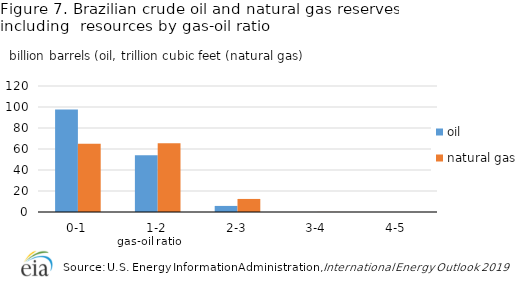
| Category | oil | natural gas |
|---|---|---|
| 0-1 | 97.554 | 65.112 |
| 1-2 | 54.121 | 65.374 |
| 2-3 | 5.79 | 12.437 |
| 3-4 | 0.023 | 0.069 |
| 4-5 | 0 | 0 |